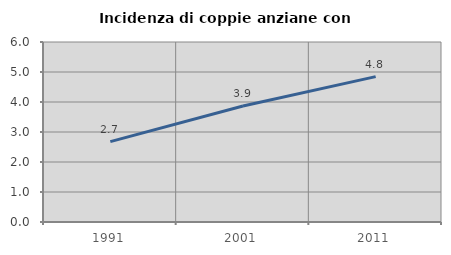
| Category | Incidenza di coppie anziane con figli |
|---|---|
| 1991.0 | 2.68 |
| 2001.0 | 3.868 |
| 2011.0 | 4.846 |